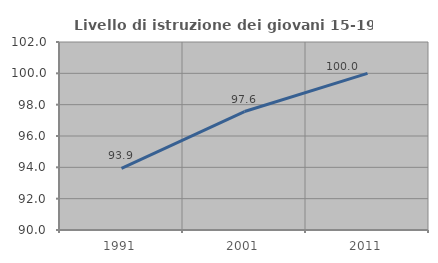
| Category | Livello di istruzione dei giovani 15-19 anni |
|---|---|
| 1991.0 | 93.939 |
| 2001.0 | 97.561 |
| 2011.0 | 100 |